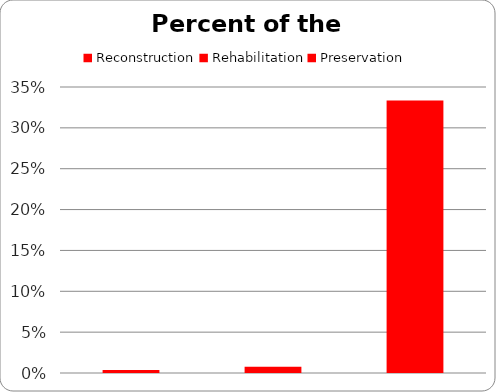
| Category | Series 0 |
|---|---|
| Reconstruction | 0.004 |
| Rehabilitation | 0.008 |
| Preservation | 0.333 |